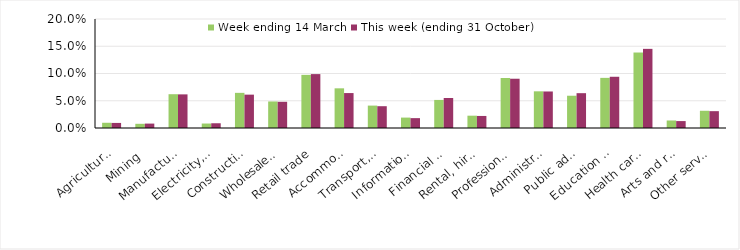
| Category | Week ending 14 March | This week (ending 31 October) |
|---|---|---|
| Agriculture, forestry and fishing | 0.01 | 0.009 |
| Mining | 0.008 | 0.008 |
| Manufacturing | 0.062 | 0.062 |
| Electricity, gas, water and waste services | 0.008 | 0.009 |
| Construction | 0.064 | 0.061 |
| Wholesale trade | 0.049 | 0.048 |
| Retail trade | 0.098 | 0.099 |
| Accommodation and food services | 0.073 | 0.064 |
| Transport, postal and warehousing | 0.041 | 0.04 |
| Information media and telecommunications | 0.019 | 0.018 |
| Financial and insurance services | 0.052 | 0.055 |
| Rental, hiring and real estate services | 0.023 | 0.022 |
| Professional, scientific and technical services | 0.092 | 0.09 |
| Administrative and support services | 0.067 | 0.067 |
| Public administration and safety | 0.059 | 0.064 |
| Education and training | 0.092 | 0.094 |
| Health care and social assistance | 0.138 | 0.145 |
| Arts and recreation services | 0.014 | 0.013 |
| Other services | 0.032 | 0.031 |